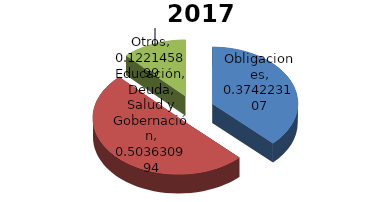
| Category | 2017 |
|---|---|
| Obligaciones | 0.374 |
| Educación, Deuda, Salud y Gobernación | 0.504 |
| Otros | 0.122 |